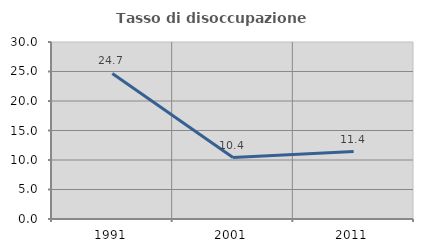
| Category | Tasso di disoccupazione giovanile  |
|---|---|
| 1991.0 | 24.675 |
| 2001.0 | 10.417 |
| 2011.0 | 11.429 |